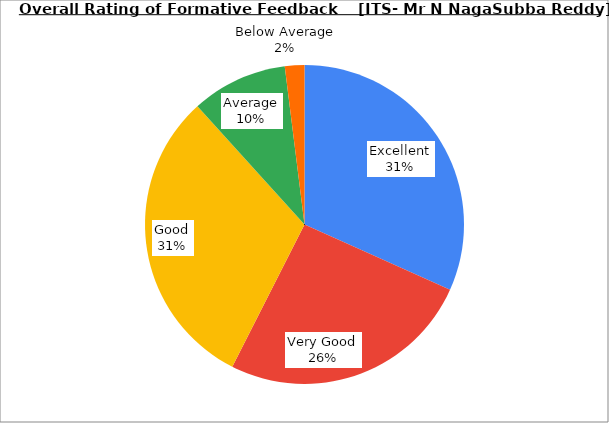
| Category | Series 0 |
|---|---|
| Excellent | 31.712 |
| Very Good | 25.766 |
| Good | 30.811 |
| Average | 9.73 |
| Below Average | 1.982 |